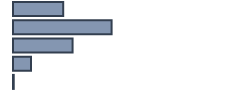
| Category | Series 0 |
|---|---|
| 0 | 22.118 |
| 1 | 43.435 |
| 2 | 26.244 |
| 3 | 7.878 |
| 4 | 0.325 |